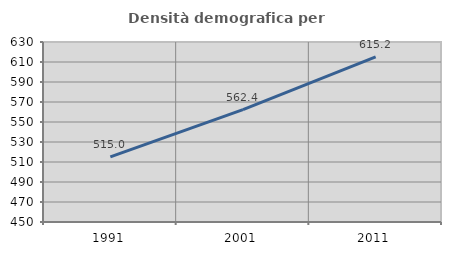
| Category | Densità demografica |
|---|---|
| 1991.0 | 515.047 |
| 2001.0 | 562.422 |
| 2011.0 | 615.171 |